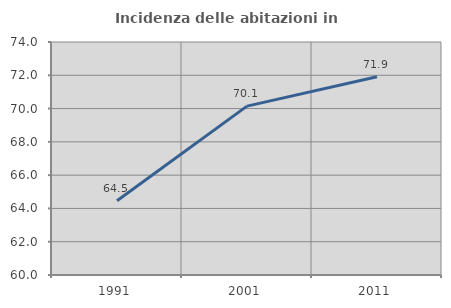
| Category | Incidenza delle abitazioni in proprietà  |
|---|---|
| 1991.0 | 64.464 |
| 2001.0 | 70.149 |
| 2011.0 | 71.907 |